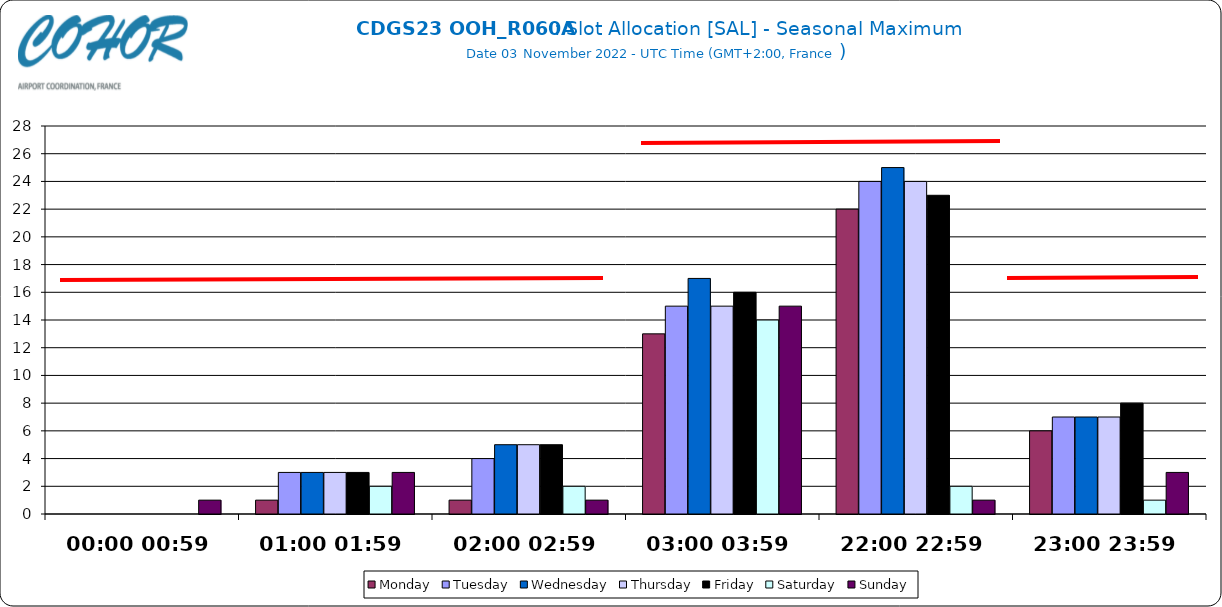
| Category | Monday | Tuesday | Wednesday | Thursday | Friday | Saturday | Sunday |
|---|---|---|---|---|---|---|---|
| 00:00 00:59 | 0 | 0 | 0 | 0 | 0 | 0 | 1 |
| 01:00 01:59 | 1 | 3 | 3 | 3 | 3 | 2 | 3 |
| 02:00 02:59 | 1 | 4 | 5 | 5 | 5 | 2 | 1 |
| 03:00 03:59 | 13 | 15 | 17 | 15 | 16 | 14 | 15 |
| 22:00 22:59 | 22 | 24 | 25 | 24 | 23 | 2 | 1 |
| 23:00 23:59 | 6 | 7 | 7 | 7 | 8 | 1 | 3 |